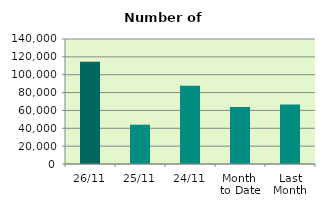
| Category | Series 0 |
|---|---|
| 26/11 | 114438 |
| 25/11 | 44026 |
| 24/11 | 87674 |
| Month 
to Date | 63839.6 |
| Last
Month | 66688.857 |